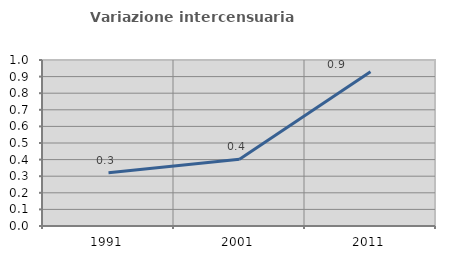
| Category | Variazione intercensuaria annua |
|---|---|
| 1991.0 | 0.321 |
| 2001.0 | 0.403 |
| 2011.0 | 0.93 |